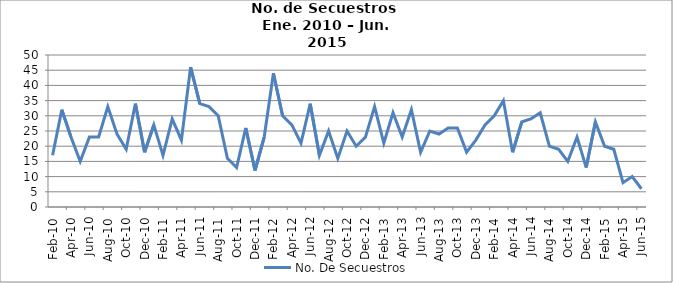
| Category | No. De Secuestros |
|---|---|
| 2010-02-01 | 17 |
| 2010-03-01 | 32 |
| 2010-04-01 | 23 |
| 2010-05-01 | 15 |
| 2010-06-01 | 23 |
| 2010-07-01 | 23 |
| 2010-08-01 | 33 |
| 2010-09-01 | 24 |
| 2010-10-01 | 19 |
| 2010-11-01 | 34 |
| 2010-12-01 | 18 |
| 2011-01-01 | 27 |
| 2011-02-01 | 17 |
| 2011-03-01 | 29 |
| 2011-04-01 | 22 |
| 2011-05-01 | 46 |
| 2011-06-01 | 34 |
| 2011-07-01 | 33 |
| 2011-08-01 | 30 |
| 2011-09-01 | 16 |
| 2011-10-01 | 13 |
| 2011-11-01 | 26 |
| 2011-12-01 | 12 |
| 2012-01-01 | 23 |
| 2012-02-01 | 44 |
| 2012-03-01 | 30 |
| 2012-04-01 | 27 |
| 2012-05-01 | 21 |
| 2012-06-01 | 34 |
| 2012-07-01 | 17 |
| 2012-08-01 | 25 |
| 2012-09-01 | 16 |
| 2012-10-01 | 25 |
| 2012-11-01 | 20 |
| 2012-12-01 | 23 |
| 2013-01-01 | 33 |
| 2013-02-01 | 21 |
| 2013-03-01 | 31 |
| 2013-04-01 | 23 |
| 2013-05-01 | 32 |
| 2013-06-01 | 18 |
| 2013-07-01 | 25 |
| 2013-08-01 | 24 |
| 2013-09-01 | 26 |
| 2013-10-01 | 26 |
| 2013-11-01 | 18 |
| 2013-12-01 | 22 |
| 2014-01-01 | 27 |
| 2014-02-01 | 30 |
| 2014-03-01 | 35 |
| 2014-04-01 | 18 |
| 2014-05-01 | 28 |
| 2014-06-01 | 29 |
| 2014-07-01 | 31 |
| 2014-08-01 | 20 |
| 2014-09-01 | 19 |
| 2014-10-01 | 15 |
| 2014-11-01 | 23 |
| 2014-12-01 | 13 |
| 2015-01-01 | 28 |
| 2015-02-01 | 20 |
| 2015-03-01 | 19 |
| 2015-04-01 | 8 |
| 2015-05-01 | 10 |
| 2015-06-01 | 6 |